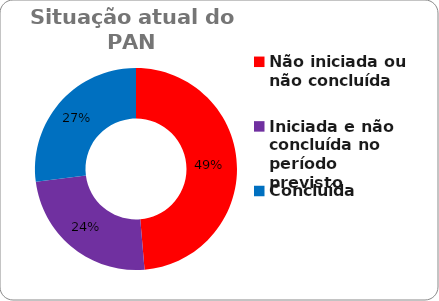
| Category | Series 0 |
|---|---|
| Não iniciada ou não concluída | 0.486 |
| Iniciada e não concluída no período previsto | 0.243 |
| Concluída | 0.27 |